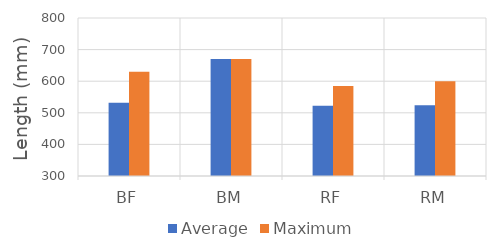
| Category | Average | Maximum |
|---|---|---|
| BF | 531.667 | 630 |
| BM | 670 | 670 |
| RF | 522.531 | 585 |
| RM | 523.661 | 600 |